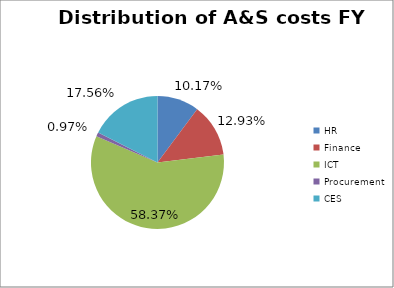
| Category | Distribution of A&S costs FY 2015/16 |
|---|---|
| HR | 0.102 |
| Finance | 0.129 |
| ICT | 0.584 |
| Procurement | 0.01 |
| CES | 0.176 |